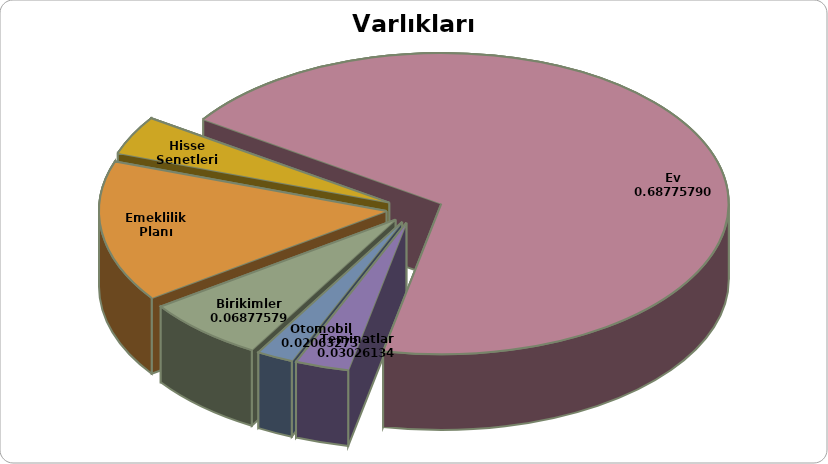
| Category | Tutar |
|---|---|
| Birikimler | 25000 |
| Emeklilik Planı | 55000 |
| Hisse Senetleri | 15000 |
| Ev | 250000 |
| Teminatlar | 11000 |
| Otomobil | 7500 |